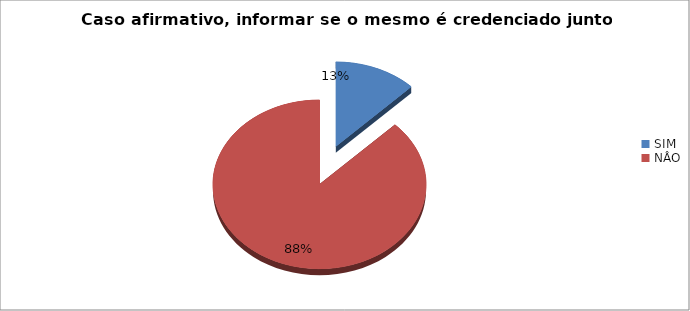
| Category | Series 0 |
|---|---|
| SIM | 0.125 |
| NÂO | 0.875 |